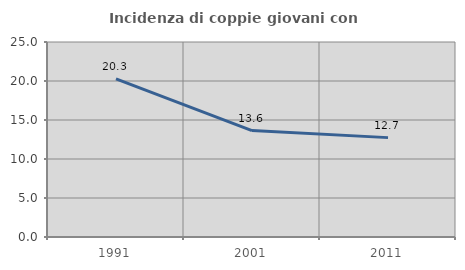
| Category | Incidenza di coppie giovani con figli |
|---|---|
| 1991.0 | 20.26 |
| 2001.0 | 13.64 |
| 2011.0 | 12.74 |